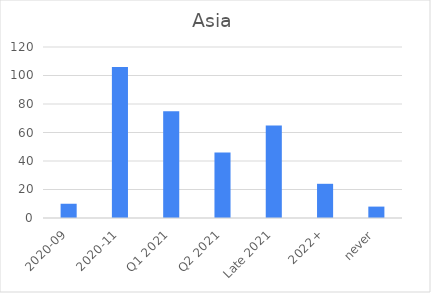
| Category | Series 0 |
|---|---|
| 2020-09 | 10 |
| 2020-11 | 106 |
| Q1 2021 | 75 |
| Q2 2021 | 46 |
| Late 2021 | 65 |
| 2022+ | 24 |
| never | 8 |